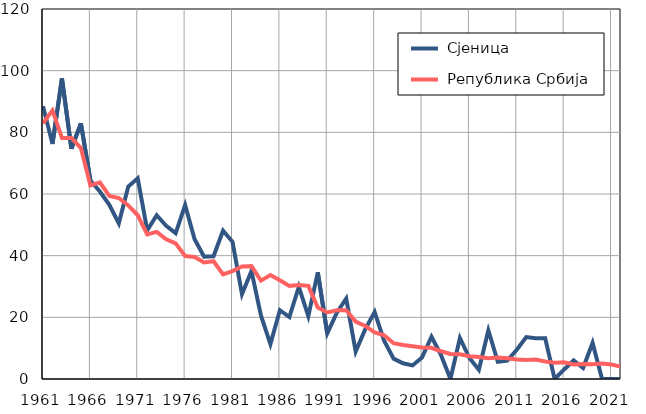
| Category |  Сјеница |  Република Србија |
|---|---|---|
| 1961.0 | 88.5 | 82.9 |
| 1962.0 | 76.2 | 87.1 |
| 1963.0 | 97.5 | 78.2 |
| 1964.0 | 74.7 | 78.2 |
| 1965.0 | 82.9 | 74.9 |
| 1966.0 | 64.4 | 62.8 |
| 1967.0 | 60.8 | 63.8 |
| 1968.0 | 56.5 | 59.4 |
| 1969.0 | 50.5 | 58.7 |
| 1970.0 | 62.4 | 56.3 |
| 1971.0 | 65.1 | 53.1 |
| 1972.0 | 48.2 | 46.9 |
| 1973.0 | 53.1 | 47.7 |
| 1974.0 | 49.7 | 45.3 |
| 1975.0 | 47.3 | 44 |
| 1976.0 | 56.4 | 39.9 |
| 1977.0 | 45.3 | 39.6 |
| 1978.0 | 39.7 | 37.8 |
| 1979.0 | 39.8 | 38.2 |
| 1980.0 | 48.1 | 33.9 |
| 1981.0 | 44.5 | 35 |
| 1982.0 | 27.5 | 36.5 |
| 1983.0 | 35 | 36.6 |
| 1984.0 | 20.6 | 31.9 |
| 1985.0 | 11.3 | 33.7 |
| 1986.0 | 22.3 | 32 |
| 1987.0 | 20.1 | 30.2 |
| 1988.0 | 29.9 | 30.5 |
| 1989.0 | 20.4 | 30.2 |
| 1990.0 | 34.6 | 23.2 |
| 1991.0 | 14.8 | 21.6 |
| 1992.0 | 21.4 | 22.3 |
| 1993.0 | 26.1 | 22.3 |
| 1994.0 | 8.9 | 18.6 |
| 1995.0 | 16.1 | 17.2 |
| 1996.0 | 21.7 | 15.1 |
| 1997.0 | 12.4 | 14.2 |
| 1998.0 | 6.6 | 11.6 |
| 1999.0 | 5.1 | 11 |
| 2000.0 | 4.4 | 10.6 |
| 2001.0 | 7 | 10.2 |
| 2002.0 | 13.7 | 10.1 |
| 2003.0 | 7.8 | 9 |
| 2004.0 | 0 | 8.1 |
| 2005.0 | 13.3 | 8 |
| 2006.0 | 6.8 | 7.4 |
| 2007.0 | 3 | 7.1 |
| 2008.0 | 15.8 | 6.7 |
| 2009.0 | 5.6 | 7 |
| 2010.0 | 6 | 6.7 |
| 2011.0 | 9.5 | 6.3 |
| 2012.0 | 13.6 | 6.2 |
| 2013.0 | 13.2 | 6.3 |
| 2014.0 | 13.2 | 5.7 |
| 2015.0 | 0 | 5.3 |
| 2016.0 | 3.1 | 5.4 |
| 2017.0 | 6 | 4.7 |
| 2018.0 | 3.6 | 4.9 |
| 2019.0 | 11.7 | 4.8 |
| 2020.0 | 0 | 5 |
| 2021.0 | 0 | 4.7 |
| 2022.0 | 0 | 4 |